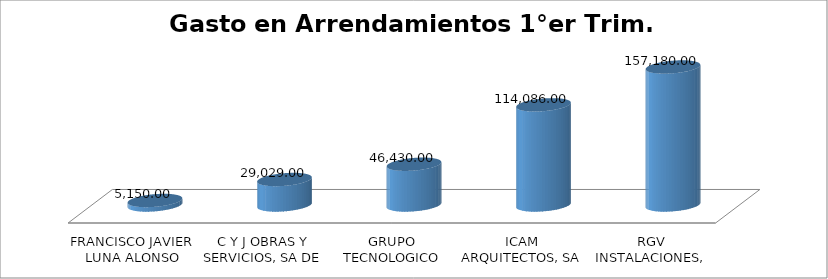
| Category | Suma |
|---|---|
| FRANCISCO JAVIER LUNA ALONSO | 5150 |
| C Y J OBRAS Y SERVICIOS, SA DE CV | 29029 |
| GRUPO TECNOLOGICO MDX, S.A. DE C.V. | 46430 |
| ICAM ARQUITECTOS, SA DE CV | 114086 |
| RGV INSTALACIONES, SA DE CV | 157180 |